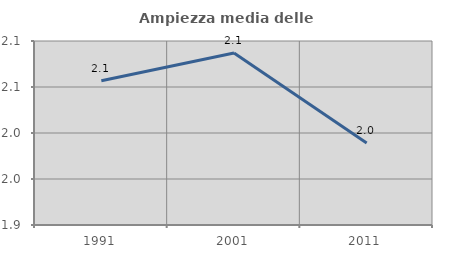
| Category | Ampiezza media delle famiglie |
|---|---|
| 1991.0 | 2.057 |
| 2001.0 | 2.087 |
| 2011.0 | 1.989 |